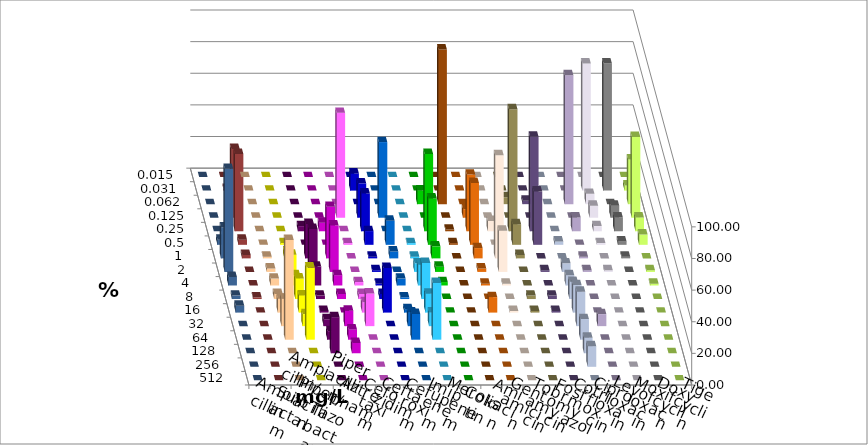
| Category | Ampicillin | Ampicillin/ Sulbactam | Piperacillin | Piperacillin/ Tazobactam | Aztreonam | Cefotaxim | Ceftazidim | Cefuroxim | Imipenem | Meropenem | Colistin | Amikacin | Gentamicin | Tobramycin | Fosfomycin | Cotrimoxazol | Ciprofloxacin | Levofloxacin | Moxifloxacin | Doxycyclin | Tigecyclin |
|---|---|---|---|---|---|---|---|---|---|---|---|---|---|---|---|---|---|---|---|---|---|
| 0.015 | 0 | 0 | 0 | 0 | 0 | 0 | 0 | 0 | 0 | 0 | 0 | 0 | 0 | 0 | 0 | 0 | 0 | 0 | 0 | 0 | 0 |
| 0.031 | 0 | 0 | 0 | 0 | 0 | 10.87 | 0 | 0 | 0 | 0 | 0 | 0 | 0 | 0 | 0 | 0 | 80.435 | 80.435 | 3.261 | 0 | 1.087 |
| 0.062 | 0 | 0 | 0 | 0 | 0 | 0 | 0 | 0 | 8.696 | 97.826 | 0 | 0 | 4.348 | 2.174 | 0 | 81.522 | 6.522 | 0 | 28.261 | 0 | 0 |
| 0.125 | 0 | 0 | 0 | 0 | 66.304 | 21.739 | 47.826 | 0 | 0 | 0 | 5.435 | 0 | 0 | 0 | 0 | 0 | 7.609 | 7.609 | 51.087 | 0 | 43.478 |
| 0.25 | 0 | 0 | 3.261 | 5.435 | 0 | 23.913 | 0 | 0 | 48.913 | 1.087 | 35.87 | 6.522 | 77.174 | 59.783 | 0 | 8.696 | 3.261 | 8.696 | 8.696 | 0 | 48.913 |
| 0.5 | 0 | 1.087 | 0 | 0 | 1.087 | 8.696 | 15.217 | 1.087 | 29.348 | 1.087 | 39.13 | 0 | 13.043 | 33.696 | 2.174 | 0 | 1.087 | 2.174 | 6.522 | 3.261 | 3.261 |
| 1.0 | 1.087 | 4.348 | 21.739 | 32.609 | 0 | 1.087 | 4.348 | 1.087 | 7.609 | 0 | 6.522 | 65.217 | 2.174 | 0 | 0 | 1.087 | 0 | 1.087 | 0 | 19.565 | 2.174 |
| 2.0 | 2.174 | 10.87 | 27.174 | 29.348 | 0 | 1.087 | 0 | 5.435 | 3.261 | 0 | 2.174 | 26.087 | 0 | 1.087 | 5.435 | 1.087 | 1.087 | 0 | 1.087 | 65.217 | 0 |
| 4.0 | 4.348 | 6.522 | 11.957 | 6.522 | 2.174 | 1.087 | 4.348 | 13.043 | 2.174 | 0 | 1.087 | 1.087 | 0 | 0 | 6.522 | 0 | 0 | 0 | 1.087 | 5.435 | 0 |
| 8.0 | 3.261 | 13.043 | 2.174 | 3.261 | 3.261 | 3.261 | 1.087 | 22.826 | 0 | 0 | 0 | 0 | 2.174 | 2.174 | 10.87 | 0 | 0 | 0 | 0 | 2.174 | 1.087 |
| 16.0 | 8.696 | 10.87 | 1.087 | 0 | 6.522 | 28.261 | 2.174 | 11.957 | 0 | 0 | 9.783 | 1.087 | 1.087 | 1.087 | 17.391 | 0 | 0 | 0 | 0 | 4.348 | 0 |
| 32.0 | 17.391 | 7.609 | 4.348 | 9.783 | 20.652 | 0 | 8.696 | 8.696 | 0 | 0 | 0 | 0 | 0 | 0 | 21.739 | 7.609 | 0 | 0 | 0 | 0 | 0 |
| 64.0 | 63.043 | 45.652 | 5.435 | 6.522 | 0 | 0 | 16.304 | 35.87 | 0 | 0 | 0 | 0 | 0 | 0 | 13.043 | 0 | 0 | 0 | 0 | 0 | 0 |
| 128.0 | 0 | 0 | 22.826 | 6.522 | 0 | 0 | 0 | 0 | 0 | 0 | 0 | 0 | 0 | 0 | 9.783 | 0 | 0 | 0 | 0 | 0 | 0 |
| 256.0 | 0 | 0 | 0 | 0 | 0 | 0 | 0 | 0 | 0 | 0 | 0 | 0 | 0 | 0 | 13.043 | 0 | 0 | 0 | 0 | 0 | 0 |
| 512.0 | 0 | 0 | 0 | 0 | 0 | 0 | 0 | 0 | 0 | 0 | 0 | 0 | 0 | 0 | 0 | 0 | 0 | 0 | 0 | 0 | 0 |